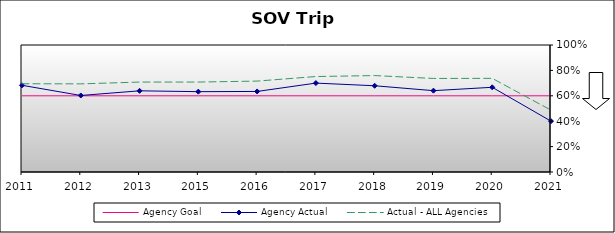
| Category | Agency Goal | Agency Actual | Actual - ALL Agencies |
|---|---|---|---|
| 2011.0 | 0.6 | 0.683 | 0.695 |
| 2012.0 | 0.6 | 0.602 | 0.694 |
| 2013.0 | 0.6 | 0.639 | 0.708 |
| 2015.0 | 0.6 | 0.633 | 0.708 |
| 2016.0 | 0.6 | 0.634 | 0.716 |
| 2017.0 | 0.6 | 0.7 | 0.752 |
| 2018.0 | 0.6 | 0.679 | 0.759 |
| 2019.0 | 0.6 | 0.64 | 0.736 |
| 2020.0 | 0.6 | 0.667 | 0.737 |
| 2021.0 | 0.6 | 0.4 | 0.487 |